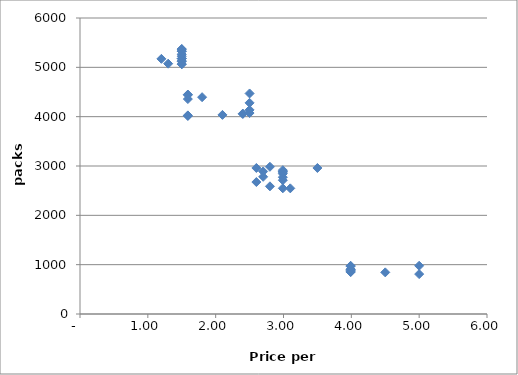
| Category | Series 0 |
|---|---|
| 3.99 | 857 |
| 3.1 | 2547 |
| 1.5 | 5177 |
| 1.5 | 5129 |
| 2.99 | 2878 |
| 2.5 | 4280 |
| 3.99 | 977 |
| 1.59 | 4449 |
| 1.59 | 4026 |
| 4.5 | 844 |
| 2.4 | 4062 |
| 2.99 | 2885 |
| 1.5 | 5330 |
| 1.59 | 4440 |
| 1.3 | 5074 |
| 1.5 | 5226 |
| 1.5 | 5369 |
| 1.5 | 5326 |
| 2.4 | 4055 |
| 2.7 | 2889 |
| 2.99 | 2915 |
| 2.8 | 2984 |
| 2.99 | 2712 |
| 3.99 | 883 |
| 3.99 | 967 |
| 2.5 | 4074 |
| 1.59 | 4013 |
| 1.8 | 4395 |
| 1.2 | 5172 |
| 1.59 | 4357 |
| 3.99 | 901 |
| 5.0 | 809 |
| 3.5 | 2960 |
| 3.99 | 910 |
| 5.0 | 978 |
| 3.99 | 849 |
| 2.5 | 4470 |
| 2.5 | 4137 |
| 2.6 | 2675 |
| 2.8 | 2588 |
| 2.7 | 2781 |
| 2.6 | 2960 |
| 2.99 | 2773 |
| 2.1 | 4036 |
| 2.99 | 2844 |
| 2.99 | 2548 |
| 1.5 | 5371 |
| 1.5 | 5265 |
| 1.5 | 5178 |
| 1.5 | 5067 |
| 1.5 | 5119 |
| 1.5 | 5062 |